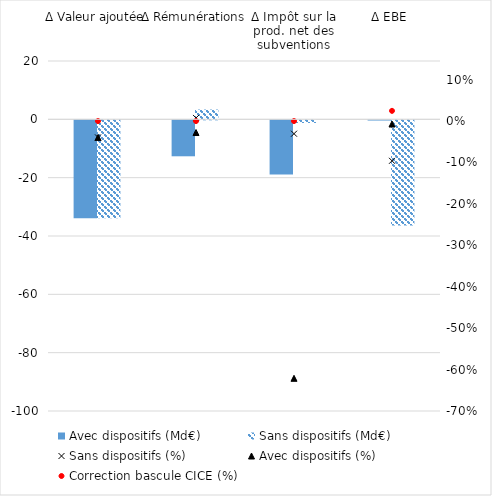
| Category | Avec dispositifs (Md€) | Sans dispositifs (Md€) |
|---|---|---|
| Δ Valeur ajoutée | -33.585 | -33.585 |
| Δ Rémunérations | -12.328 | 3.363 |
| Δ Impôt sur la prod. net des subventions | -18.573 | -0.913 |
| Δ EBE | -0.073 | -36.032 |